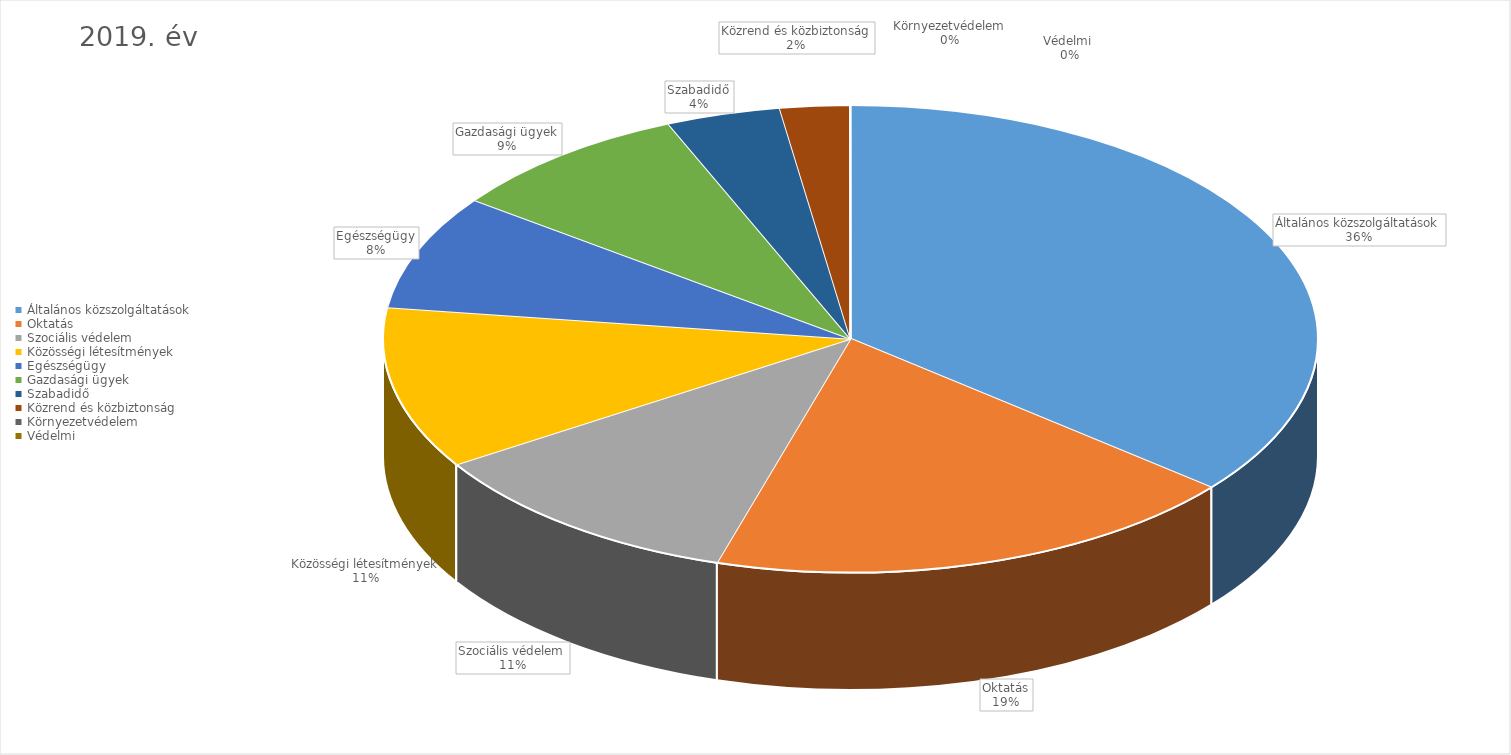
| Category | 2019. év |
|---|---|
| Általános közszolgáltatások | 11033815443 |
| Oktatás | 5715781299 |
| Szociális védelem | 3482496800 |
| Közösségi létesítmények | 3429801758 |
| Egészségügy | 2441519966 |
| Gazdasági ügyek | 2610705640 |
| Szabadidő | 1212567750 |
| Közrend és közbiztonság | 740275000 |
| Környezetvédelem | 0 |
| Védelmi  | 3268000 |